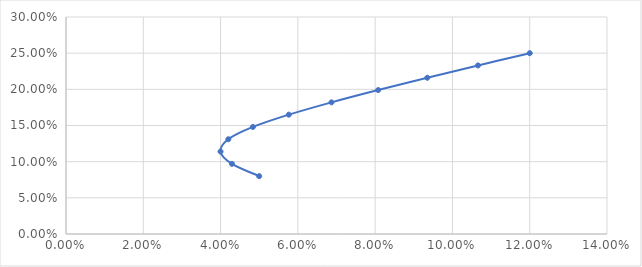
| Category | Retorno |
|---|---|
| 0.04998619809507422 | 0.08 |
| 0.04294144472418227 | 0.097 |
| 0.039991214035085265 | 0.114 |
| 0.042007244315712976 | 0.131 |
| 0.048372531461564 | 0.148 |
| 0.0576643466537166 | 0.165 |
| 0.06870541317829328 | 0.182 |
| 0.08078163513447839 | 0.199 |
| 0.09349274410348642 | 0.216 |
| 0.10661189274654113 | 0.233 |
| 0.12000533321482003 | 0.25 |